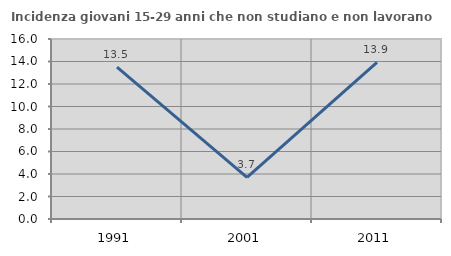
| Category | Incidenza giovani 15-29 anni che non studiano e non lavorano  |
|---|---|
| 1991.0 | 13.509 |
| 2001.0 | 3.704 |
| 2011.0 | 13.924 |